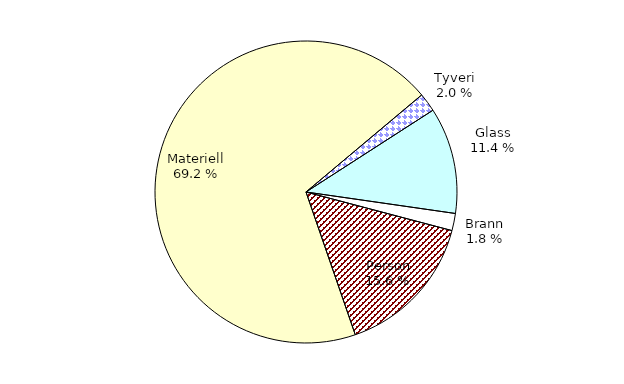
| Category | Series 0 |
|---|---|
| Tyveri | 131.564 |
| Glass | 747.482 |
| Brann | 120.848 |
| Person | 1024.12 |
| Materiell | 4542.987 |